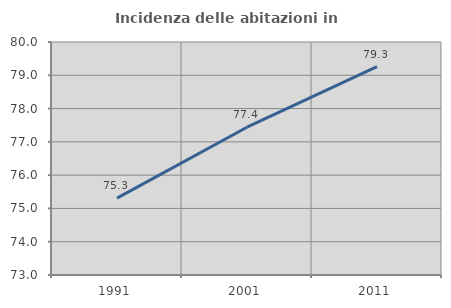
| Category | Incidenza delle abitazioni in proprietà  |
|---|---|
| 1991.0 | 75.311 |
| 2001.0 | 77.44 |
| 2011.0 | 79.258 |